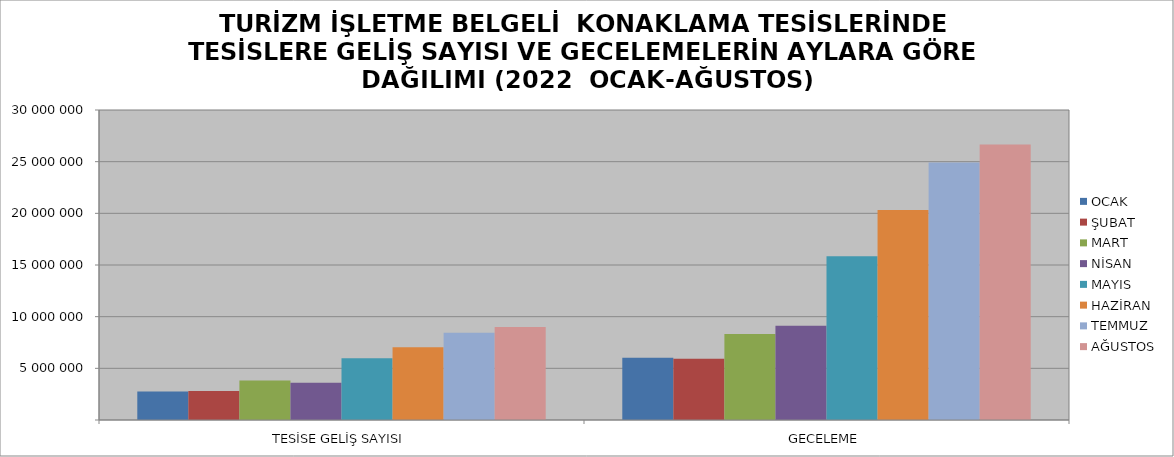
| Category | OCAK | ŞUBAT | MART | NİSAN | MAYIS | HAZİRAN | TEMMUZ | AĞUSTOS |
|---|---|---|---|---|---|---|---|---|
| TESİSE GELİŞ SAYISI | 2752012 | 2800059 | 3828458 | 3612924 | 5975439 | 7040520 | 8433434 | 8994064 |
| GECELEME | 6020345 | 5929648 | 8312048 | 9130051 | 15857894 | 20320271 | 24913644 | 26662869 |